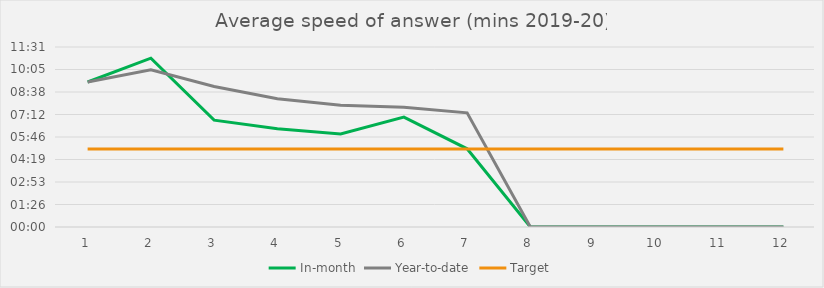
| Category | In-month | Year-to-date | Target |
|---|---|---|---|
| 0 | 0.006 | 0.006 | 0.003 |
| 1 | 0.008 | 0.007 | 0.003 |
| 2 | 0.005 | 0.006 | 0.003 |
| 3 | 0.004 | 0.006 | 0.003 |
| 4 | 0.004 | 0.005 | 0.003 |
| 5 | 0.005 | 0.005 | 0.003 |
| 6 | 0.003 | 0.005 | 0.003 |
| 7 | 0 | 0 | 0.003 |
| 8 | 0 | 0 | 0.003 |
| 9 | 0 | 0 | 0.003 |
| 10 | 0 | 0 | 0.003 |
| 11 | 0 | 0 | 0.003 |